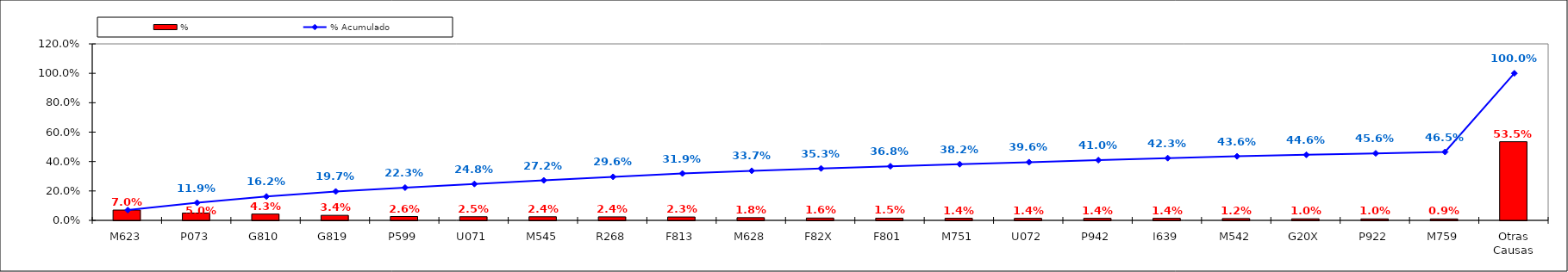
| Category | % |
|---|---|
| M623 | 0.07 |
| P073 | 0.05 |
| G810 | 0.043 |
| G819 | 0.034 |
| P599 | 0.026 |
| U071 | 0.025 |
| M545 | 0.024 |
| R268 | 0.024 |
| F813 | 0.023 |
| M628 | 0.018 |
| F82X | 0.016 |
| F801 | 0.015 |
| M751 | 0.014 |
| U072 | 0.014 |
| P942 | 0.014 |
| I639 | 0.014 |
| M542 | 0.012 |
| G20X | 0.01 |
| P922 | 0.01 |
| M759 | 0.009 |
| Otras Causas | 0.535 |